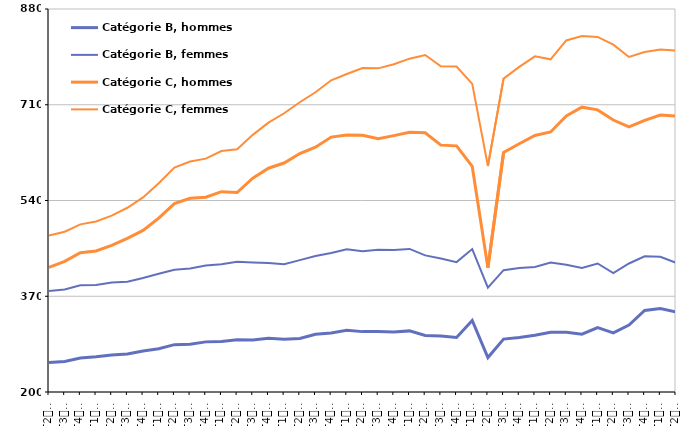
| Category | Catégorie B, hommes | Catégorie B, femmes | Catégorie C, hommes | Catégorie C, femmes |
|---|---|---|---|---|
| T2
2013 | 252.3 | 379.3 | 421.4 | 477.7 |
| T3
2013 | 254.2 | 382 | 431.9 | 484.6 |
| T4
2013 | 260.2 | 389.4 | 447.3 | 497.6 |
| T1
2014 | 262.4 | 390.1 | 450.3 | 502.8 |
| T2
2014 | 265.7 | 394.6 | 460.2 | 513.1 |
| T3
2014 | 267.5 | 395.7 | 472.9 | 527.1 |
| T4
2014 | 272.8 | 402.4 | 486.8 | 545.4 |
| T1
2015 | 276.9 | 410 | 508.8 | 570.5 |
| T2
2015 | 284.1 | 417.1 | 534.4 | 598.5 |
| T3
2015 | 284.9 | 419.4 | 543.9 | 609.2 |
| T4
2015 | 289 | 424.5 | 545.8 | 614.3 |
| T1
2016 | 289.8 | 426.9 | 555.7 | 627.8 |
| T2
2016 | 292.6 | 431.1 | 554.2 | 631.1 |
| T3
2016 | 292.2 | 429.9 | 579.7 | 656.5 |
| T4
2016 | 295.5 | 429.1 | 597.3 | 678.2 |
| T1
2017 | 293.8 | 426.9 | 606.5 | 694.9 |
| T2
2017 | 295.1 | 434.1 | 623.3 | 714.5 |
| T3
2017 | 302.5 | 441.5 | 634.7 | 732.1 |
| T4
2017 | 304.6 | 446.8 | 652.6 | 753.4 |
| T1
2018 | 309.5 | 453.4 | 656.3 | 764.6 |
| T2
2018 | 307.2 | 449.8 | 655.8 | 775.2 |
| T3
2018 | 307.2 | 452.6 | 649.9 | 774.6 |
| T4
2018 | 306.4 | 452.1 | 655.2 | 781.8 |
| T1
2019 | 308.5 | 454 | 661 | 791.8 |
| T2
2019 | 300.3 | 442.6 | 660.2 | 798.4 |
| T3
2019 | 299.4 | 437.1 | 638.3 | 778.2 |
| T4
2019 | 296.8 | 430.6 | 637 | 777.9 |
| T1
2020 | 326.9 | 453.8 | 600.5 | 747.1 |
| T2
2020 | 261.1 | 385.4 | 420.7 | 601.3 |
| T3
2020 | 294 | 416.3 | 625.3 | 756.4 |
| T4
2020 | 296.9 | 420.3 | 640.8 | 777.3 |
| T1
2021 | 300.6 | 422.1 | 655.4 | 795.9 |
| T2
2021 | 306 | 429.7 | 661.7 | 790.6 |
| T3
2021 | 306.2 | 425.8 | 690.1 | 824.1 |
| T4
2021 | 302.6 | 420.3 | 705.7 | 832.1 |
| T1
2022 | 314.2 | 428.2 | 700.9 | 830.4 |
| T2
2022 | 305.1 | 411.3 | 682.9 | 816.7 |
| T3
2022 | 318.8 | 428.2 | 670.6 | 794.9 |
| T4
2022 | 344.7 | 440.9 | 682.2 | 803.7 |
| T1
2023 | 348.2 | 440 | 691.7 | 808.2 |
| T2
2023 | 342.2 | 429.6 | 690 | 806.3 |